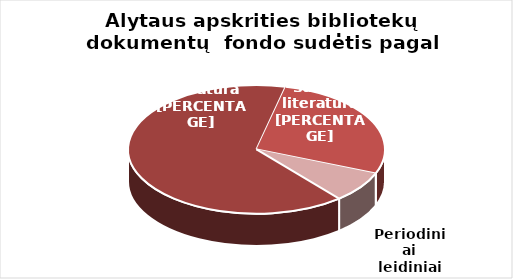
| Category | Series 0 |
|---|---|
| Grožinė literatūra* | 990951 |
| Šakinė literatūra* | 420091 |
| Periodiniai leidiniai | 119281 |